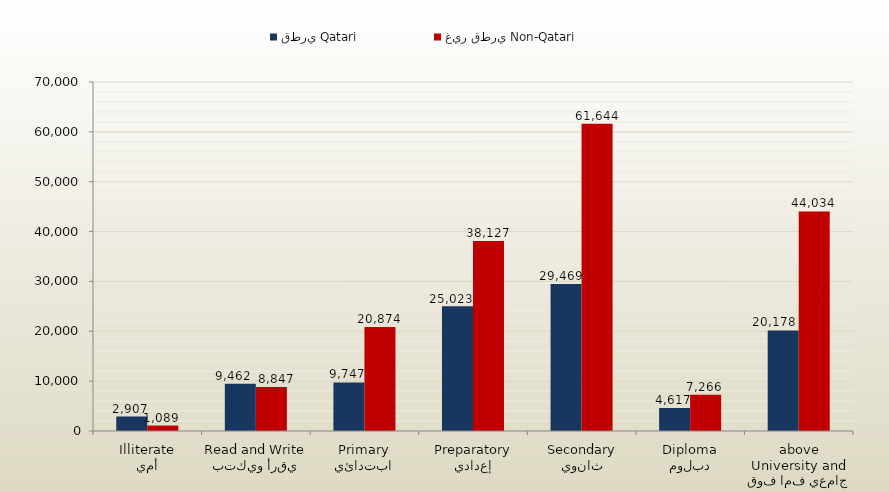
| Category | قطري Qatari | غير قطري Non-Qatari |
|---|---|---|
| أمي
Illiterate | 2907 | 1089 |
| يقرأ ويكتب
Read and Write | 9462 | 8847 |
| ابتدائي
Primary | 9747 | 20874 |
| إعدادي
Preparatory | 25023 | 38127 |
| ثانوي
Secondary | 29469 | 61644 |
| دبلوم
Diploma | 4617 | 7266 |
| جامعي فما فوق
University and above | 20178 | 44034 |